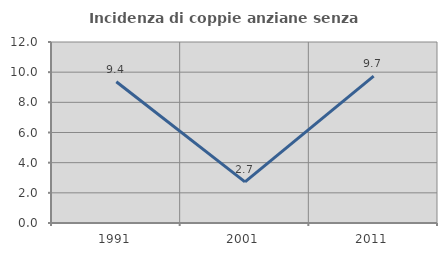
| Category | Incidenza di coppie anziane senza figli  |
|---|---|
| 1991.0 | 9.362 |
| 2001.0 | 2.727 |
| 2011.0 | 9.744 |